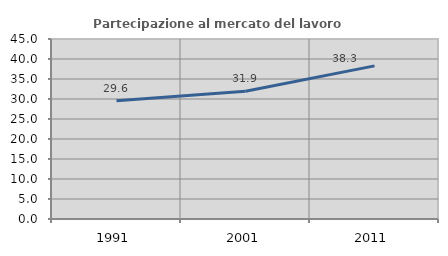
| Category | Partecipazione al mercato del lavoro  femminile |
|---|---|
| 1991.0 | 29.57 |
| 2001.0 | 31.948 |
| 2011.0 | 38.282 |